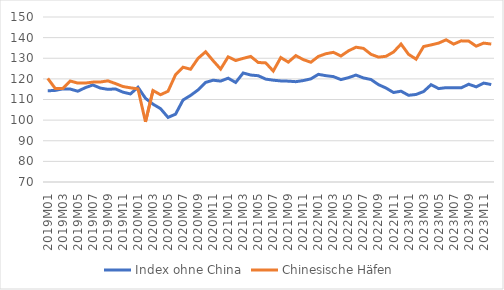
| Category | Index ohne China | Chinesische Häfen |
|---|---|---|
| 2019M01 | 114.216 | 120.221 |
| 2019M02 | 114.416 | 115.32 |
| 2019M03 | 115.147 | 115.329 |
| 2019M04 | 115.045 | 118.957 |
| 2019M05 | 114.019 | 117.954 |
| 2019M06 | 115.747 | 117.977 |
| 2019M07 | 117.033 | 118.428 |
| 2019M08 | 115.537 | 118.485 |
| 2019M09 | 114.919 | 119.044 |
| 2019M10 | 115.127 | 117.735 |
| 2019M11 | 113.563 | 116.29 |
| 2019M12 | 112.695 | 115.665 |
| 2020M01 | 115.949 | 115.145 |
| 2020M02 | 110.58 | 99.181 |
| 2020M03 | 107.741 | 114.349 |
| 2020M04 | 105.58 | 112.313 |
| 2020M05 | 101.32 | 113.992 |
| 2020M06 | 102.879 | 122.026 |
| 2020M07 | 109.766 | 125.652 |
| 2020M08 | 111.975 | 124.67 |
| 2020M09 | 114.655 | 129.966 |
| 2020M10 | 118.285 | 133.14 |
| 2020M11 | 119.352 | 128.809 |
| 2020M12 | 118.93 | 124.746 |
| 2021M01 | 120.333 | 130.686 |
| 2021M02 | 118.255 | 128.901 |
| 2021M03 | 122.864 | 129.944 |
| 2021M04 | 121.857 | 130.881 |
| 2021M05 | 121.533 | 127.946 |
| 2021M06 | 119.889 | 127.755 |
| 2021M07 | 119.357 | 123.798 |
| 2021M08 | 119.013 | 130.342 |
| 2021M09 | 118.897 | 128.117 |
| 2021M10 | 118.639 | 131.282 |
| 2021M11 | 119.181 | 129.331 |
| 2021M12 | 120.005 | 128.055 |
| 2022M01 | 122.199 | 130.871 |
| 2022M02 | 121.551 | 132.185 |
| 2022M03 | 121.1 | 132.873 |
| 2022M04 | 119.655 | 131.083 |
| 2022M05 | 120.575 | 133.571 |
| 2022M06 | 121.842 | 135.356 |
| 2022M07 | 120.454 | 134.789 |
| 2022M08 | 119.688 | 131.914 |
| 2022M09 | 117.201 | 130.545 |
| 2022M10 | 115.563 | 130.949 |
| 2022M11 | 113.39 | 133.019 |
| 2022M12 | 114.029 | 136.888 |
| 2023M01 | 112.037 | 131.901 |
| 2023M02 | 112.44 | 129.564 |
| 2023M03 | 113.862 | 135.672 |
| 2023M04 | 117.184 | 136.469 |
| 2023M05 | 115.289 | 137.349 |
| 2023M06 | 115.743 | 138.945 |
| 2023M07 | 115.751 | 136.85 |
| 2023M08 | 115.642 | 138.435 |
| 2023M09 | 117.411 | 138.323 |
| 2023M10 | 116.137 | 135.856 |
| 2023M11 | 117.961 | 137.351 |
| 2023M12 | 117.246 | 136.874 |